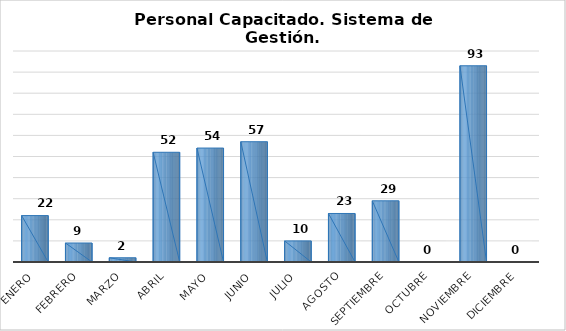
| Category | Personal capacitado/2 |
|---|---|
| Enero | 22 |
| Febrero | 9 |
| Marzo | 2 |
| Abril | 52 |
| Mayo | 54 |
| Junio | 57 |
| Julio | 10 |
| Agosto | 23 |
| Septiembre | 29 |
| Octubre | 0 |
| Noviembre | 93 |
| Diciembre | 0 |